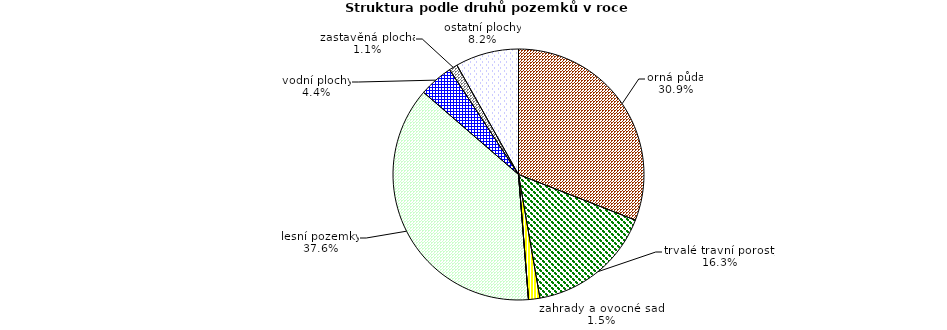
| Category | Struktura druhů pozemků |
|---|---|
| orná půda | 311036 |
| trvalé travní porosty | 164299 |
| zahrady a ovocné sady | 14717 |
| chmelnice a vinice | 0 |
| lesní pozemky | 378332 |
| vodní plochy | 44138 |
| zastavěná plocha | 11008 |
| ostatní plochy | 82132 |